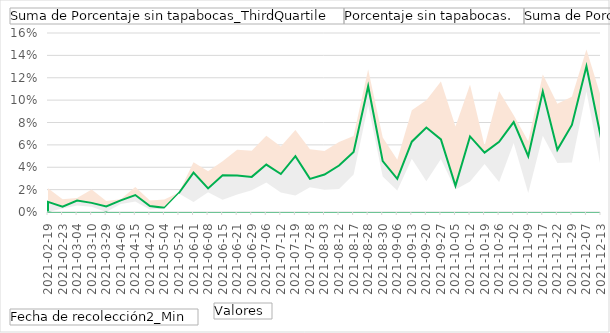
| Category | Suma de Porcentaje sin tapabocas_ThirdQuartile | Porcentaje sin tapabocas. | Suma de Porcentaje sin tapabocas_FirstQuartile |
|---|---|---|---|
| 2021-02-19 | 0.021 | 0.009 | 0 |
| 2021-02-23 | 0.011 | 0.005 | 0.003 |
| 2021-03-04 | 0.013 | 0.01 | 0.006 |
| 2021-03-10 | 0.02 | 0.008 | 0.005 |
| 2021-03-29 | 0.01 | 0.005 | 0 |
| 2021-04-06 | 0.011 | 0.01 | 0.007 |
| 2021-04-15 | 0.022 | 0.015 | 0.009 |
| 2021-04-20 | 0.01 | 0.005 | 0.002 |
| 2021-05-04 | 0.011 | 0.004 | 0.003 |
| 2021-05-21 | 0.017 | 0.017 | 0.017 |
| 2021-06-01 | 0.044 | 0.035 | 0.009 |
| 2021-06-08 | 0.036 | 0.021 | 0.018 |
| 2021-06-15 | 0.045 | 0.033 | 0.011 |
| 2021-06-21 | 0.056 | 0.033 | 0.016 |
| 2021-06-29 | 0.055 | 0.031 | 0.019 |
| 2021-07-06 | 0.068 | 0.042 | 0.026 |
| 2021-07-12 | 0.058 | 0.034 | 0.017 |
| 2021-07-19 | 0.073 | 0.05 | 0.015 |
| 2021-07-28 | 0.056 | 0.03 | 0.022 |
| 2021-08-03 | 0.055 | 0.033 | 0.02 |
| 2021-08-12 | 0.062 | 0.042 | 0.021 |
| 2021-08-17 | 0.068 | 0.054 | 0.034 |
| 2021-08-28 | 0.127 | 0.112 | 0.096 |
| 2021-08-30 | 0.067 | 0.045 | 0.032 |
| 2021-09-06 | 0.047 | 0.03 | 0.019 |
| 2021-09-13 | 0.091 | 0.063 | 0.048 |
| 2021-09-20 | 0.1 | 0.076 | 0.028 |
| 2021-09-27 | 0.117 | 0.065 | 0.047 |
| 2021-10-05 | 0.076 | 0.023 | 0.02 |
| 2021-10-12 | 0.114 | 0.068 | 0.027 |
| 2021-10-19 | 0.059 | 0.053 | 0.043 |
| 2021-10-26 | 0.108 | 0.063 | 0.027 |
| 2021-11-02 | 0.086 | 0.08 | 0.062 |
| 2021-11-09 | 0.063 | 0.05 | 0.017 |
| 2021-11-17 | 0.123 | 0.108 | 0.068 |
| 2021-11-22 | 0.097 | 0.056 | 0.044 |
| 2021-11-29 | 0.103 | 0.078 | 0.044 |
| 2021-12-07 | 0.145 | 0.13 | 0.108 |
| 2021-12-13 | 0.103 | 0.066 | 0.039 |